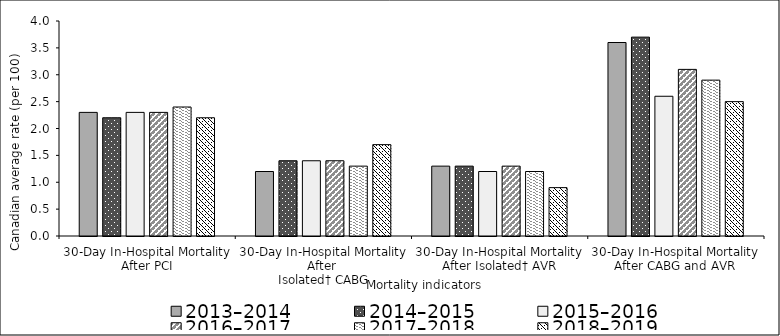
| Category | 2013–2014 | 2014–2015 | 2015–2016 | 2016–2017 | 2017–2018 | 2018–2019 |
|---|---|---|---|---|---|---|
| 30-Day In-Hospital Mortality After PCI | 2.3 | 2.2 | 2.3 | 2.3 | 2.4 | 2.2 |
| 30-Day In-Hospital Mortality After 
Isolated† CABG | 1.2 | 1.4 | 1.4 | 1.4 | 1.3 | 1.7 |
| 30-Day In-Hospital Mortality After Isolated† AVR | 1.3 | 1.3 | 1.2 | 1.3 | 1.2 | 0.9 |
| 30-Day In-Hospital Mortality After CABG and AVR | 3.6 | 3.7 | 2.6 | 3.1 | 2.9 | 2.5 |